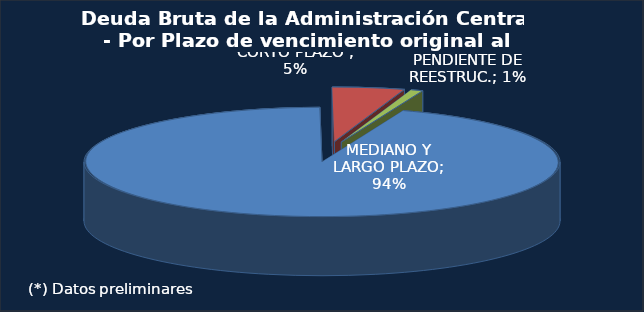
| Category | Series 0 |
|---|---|
| MEDIANO Y LARGO PLAZO | 293493.1 |
| CORTO PLAZO  | 15238.8 |
| DEUDA PENDIENTE DE REESTRUC. | 2508.5 |